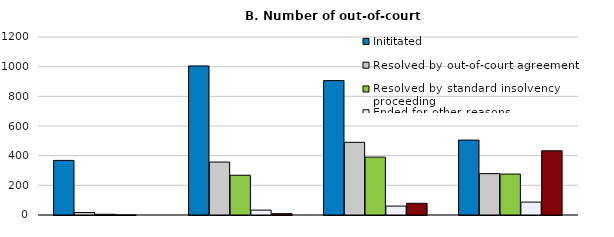
| Category | Inititated | Resolved by out-of-court agreement | Resolved by standard insolvency proceeding | Ended for other reasons | Initiated but not yet resolved or ended |
|---|---|---|---|---|---|
|  | 368 | 17 | 5 | 1 | 0 |
|  | 1005 | 357 | 268 | 33 | 9 |
|  | 906 | 490 | 390 | 60 | 79 |
|  | 505 | 279 | 276 | 87 | 433 |